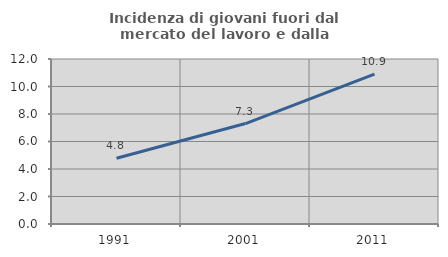
| Category | Incidenza di giovani fuori dal mercato del lavoro e dalla formazione  |
|---|---|
| 1991.0 | 4.778 |
| 2001.0 | 7.305 |
| 2011.0 | 10.902 |